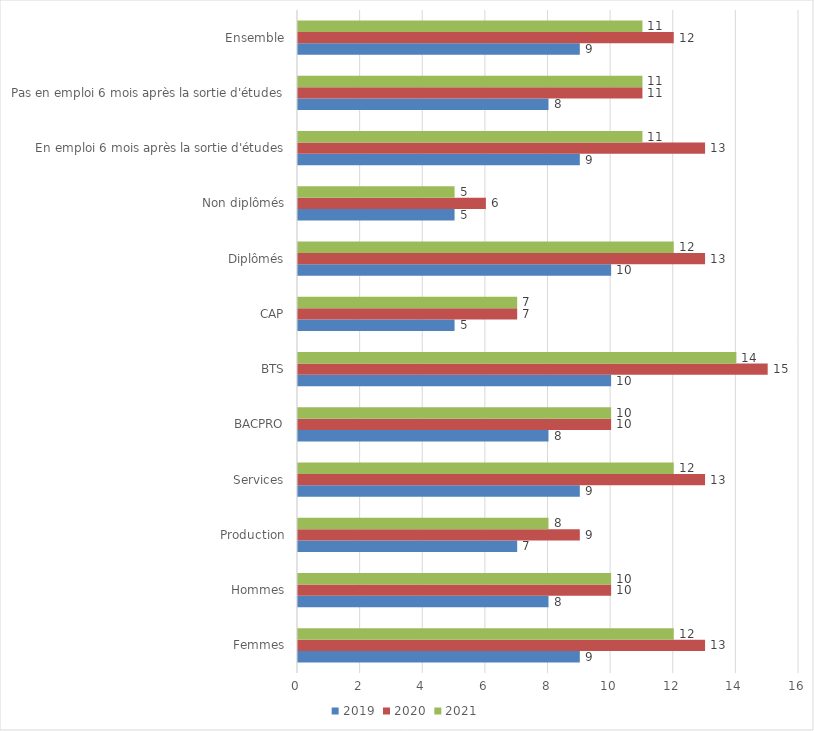
| Category | 2019 | 2020 | 2021 |
|---|---|---|---|
| Femmes | 9 | 13 | 12 |
| Hommes | 8 | 10 | 10 |
| Production | 7 | 9 | 8 |
| Services | 9 | 13 | 12 |
| BACPRO | 8 | 10 | 10 |
| BTS | 10 | 15 | 14 |
| CAP | 5 | 7 | 7 |
| Diplômés | 10 | 13 | 12 |
| Non diplômés | 5 | 6 | 5 |
| En emploi 6 mois après la sortie d'études | 9 | 13 | 11 |
| Pas en emploi 6 mois après la sortie d'études | 8 | 11 | 11 |
| Ensemble | 9 | 12 | 11 |